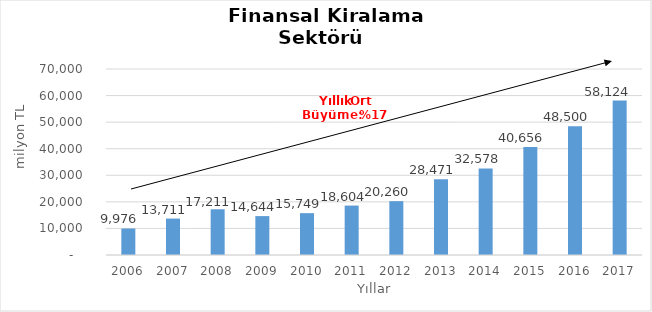
| Category | Finansal Kiralama  |
|---|---|
| 2006.0 | 9976.07 |
| 2007.0 | 13710.562 |
| 2008.0 | 17210.614 |
| 2009.0 | 14644.05 |
| 2010.0 | 15748.853 |
| 2011.0 | 18604.083 |
| 2012.0 | 20259.96 |
| 2013.0 | 28470.82 |
| 2014.0 | 32578 |
| 2015.0 | 40656 |
| 2016.0 | 48500 |
| 2017.0 | 58124 |